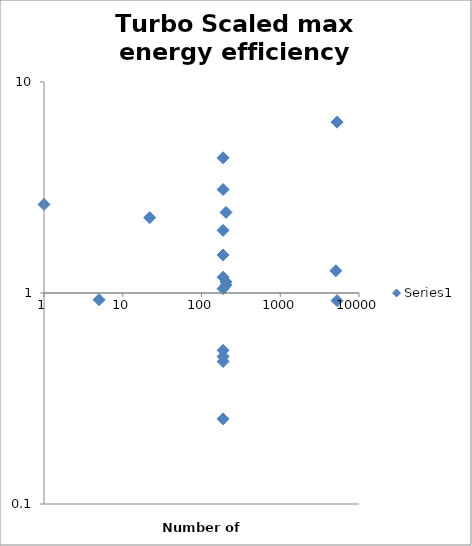
| Category | Series 0 |
|---|---|
| 5263.0 | 6.452 |
| 5075.0 | 0 |
| 5263.0 | 0.92 |
| 205.0 | 1.089 |
| 188.0 | 1.049 |
| 188.0 | 1.98 |
| 188.0 | 0 |
| 205.0 | 2.409 |
| 188.0 | 0.474 |
| 5092.0 | 1.276 |
| 205.0 | 1.127 |
| 188.0 | 3.093 |
| 188.0 | 4.371 |
| 22.0 | 2.277 |
| 188.0 | 0 |
| 188.0 | 1.515 |
| 188.0 | 0.535 |
| 188.0 | 0.5 |
| 188.0 | 1.188 |
| 188.0 | 0.253 |
| 5.0 | 0.929 |
| 1.0 | 2.628 |